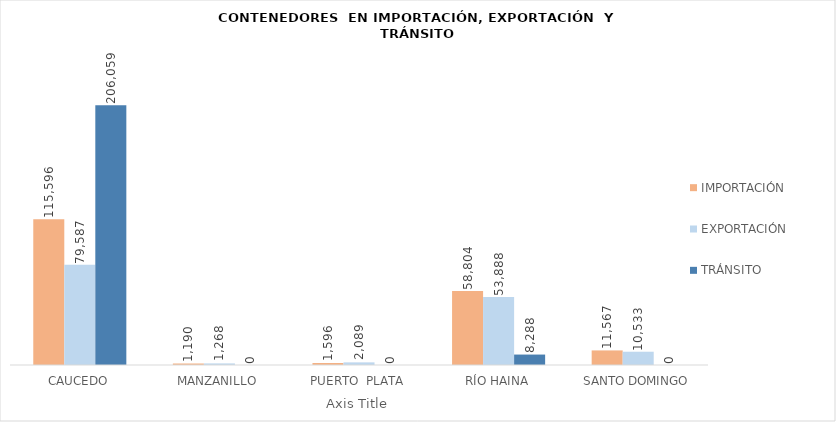
| Category | IMPORTACIÓN  | EXPORTACIÓN  | TRÁNSITO |
|---|---|---|---|
| CAUCEDO | 115595.5 | 79587 | 206058.5 |
| MANZANILLO | 1190 | 1268 | 0 |
| PUERTO  PLATA | 1596 | 2089 | 0 |
| RÍO HAINA | 58803.5 | 53888 | 8287.75 |
| SANTO DOMINGO | 11566.75 | 10533 | 0 |